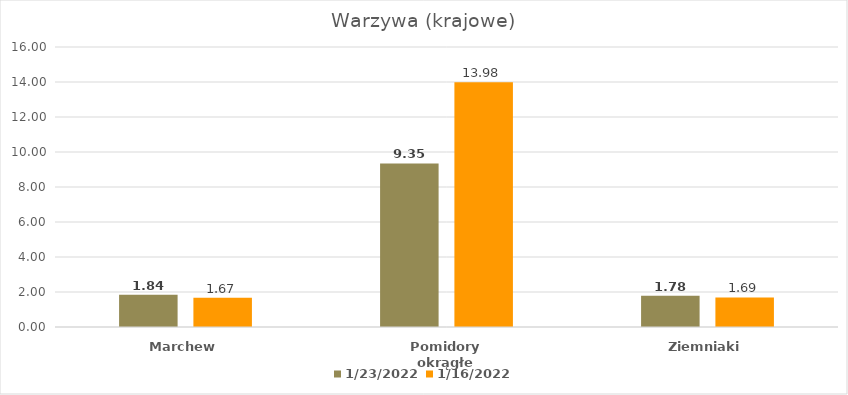
| Category | 2022-01-23 | 2022-01-16 |
|---|---|---|
| Marchew | 1.84 | 1.67 |
| Pomidory okrągłe | 9.35 | 13.98 |
| Ziemniaki | 1.78 | 1.69 |